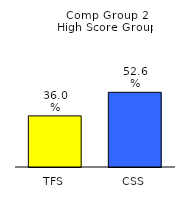
| Category | Series 0 |
|---|---|
| TFS | 0.36 |
| CSS | 0.526 |